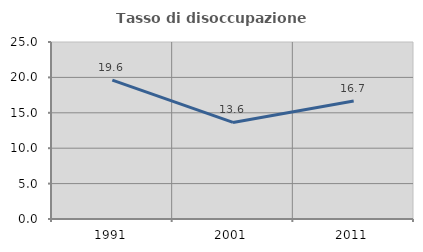
| Category | Tasso di disoccupazione giovanile  |
|---|---|
| 1991.0 | 19.608 |
| 2001.0 | 13.636 |
| 2011.0 | 16.667 |